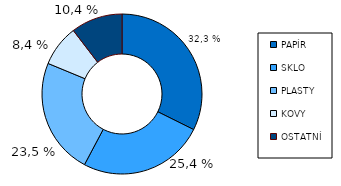
| Category | 2013 |
|---|---|
| PAPÍR | 145012.251 |
| SKLO | 114062.12 |
| PLASTY | 105235.452 |
| KOVY | 37460.832 |
| OSTATNÍ  | 46657.497 |